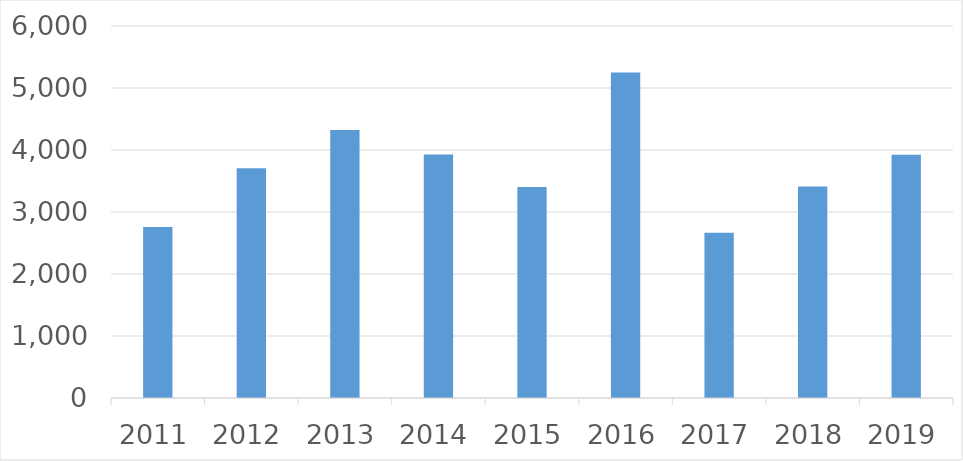
| Category | Series 0 |
|---|---|
| 2011 | 2759 |
| 2012 | 3706 |
| 2013 | 4321 |
| 2014 | 3928 |
| 2015 | 3405 |
| 2016 | 5249 |
| 2017 | 2664 |
| 2018 | 3410 |
| 2019 | 3923 |